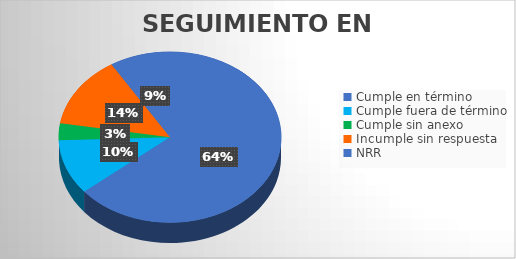
| Category | TOTAL |
|---|---|
| Cumple en término | 80 |
| Cumple fuera de término | 13 |
| Cumple sin anexo | 4 |
| Incumple sin respuesta | 17 |
| NRR | 11 |